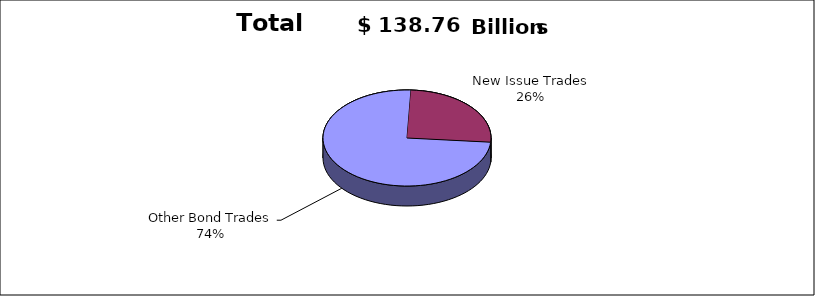
| Category | Series 0 |
|---|---|
| Other Bond Trades | 103184629372 |
| New Issue Trades | 35571716663 |